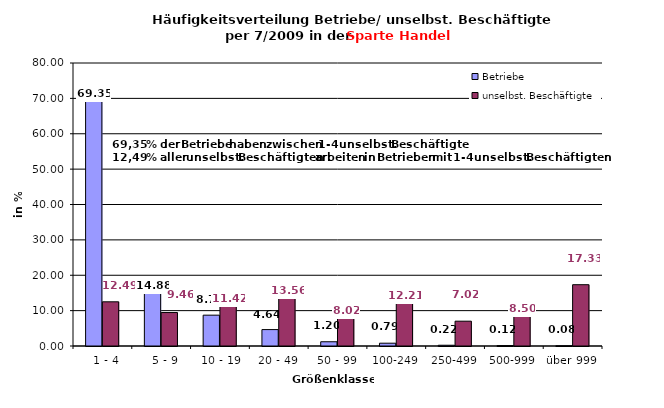
| Category | Betriebe | unselbst. Beschäftigte |
|---|---|---|
|   1 - 4 | 69.354 | 12.494 |
|   5 - 9 | 14.876 | 9.458 |
|  10 - 19 | 8.717 | 11.417 |
| 20 - 49 | 4.642 | 13.556 |
| 50 - 99 | 1.2 | 8.016 |
| 100-249 | 0.792 | 12.213 |
| 250-499 | 0.215 | 7.016 |
| 500-999 | 0.125 | 8.5 |
| über 999 | 0.079 | 17.33 |